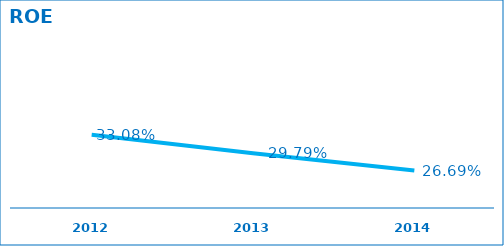
| Category | ROE |
|---|---|
| 2012.0 | 0.331 |
| 2013.0 | 0.298 |
| 2014.0 | 0.267 |